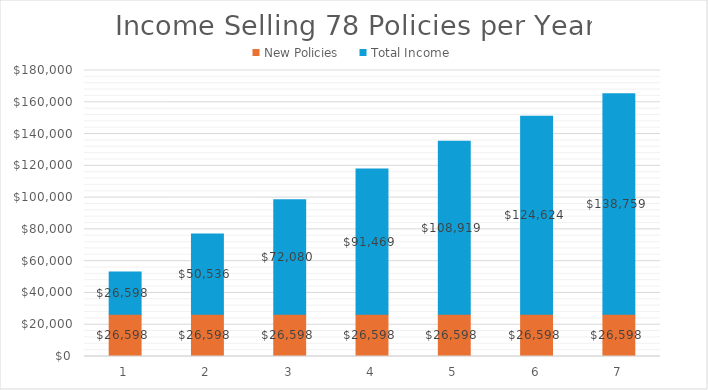
| Category | New Policies | Total Income |
|---|---|---|
| 1.0 | 26598 | 26598 |
| 2.0 | 26598 | 50536 |
| 3.0 | 26598 | 72080 |
| 4.0 | 26598 | 91469 |
| 5.0 | 26598 | 108919 |
| 6.0 | 26598 | 124624 |
| 7.0 | 26598 | 138758.5 |